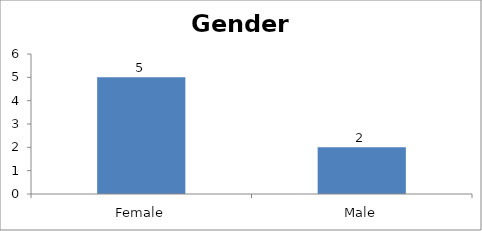
| Category | Gender |
|---|---|
| Female | 5 |
| Male | 2 |